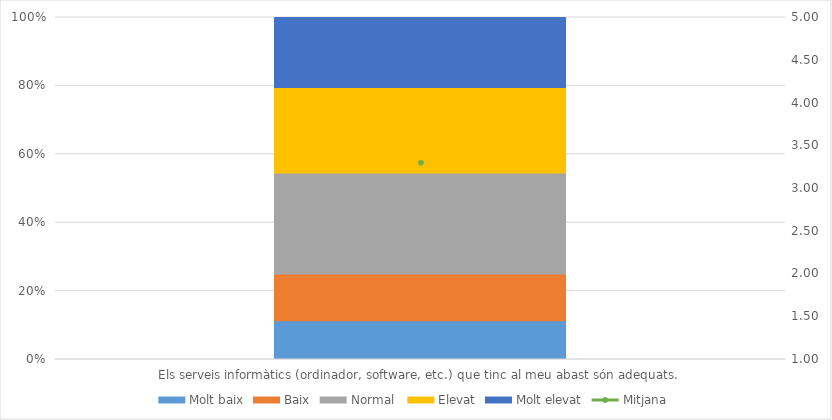
| Category | Molt baix | Baix | Normal  | Elevat | Molt elevat |
|---|---|---|---|---|---|
| Els serveis informàtics (ordinador, software, etc.) que tinc al meu abast són adequats. | 5 | 6 | 13 | 11 | 9 |